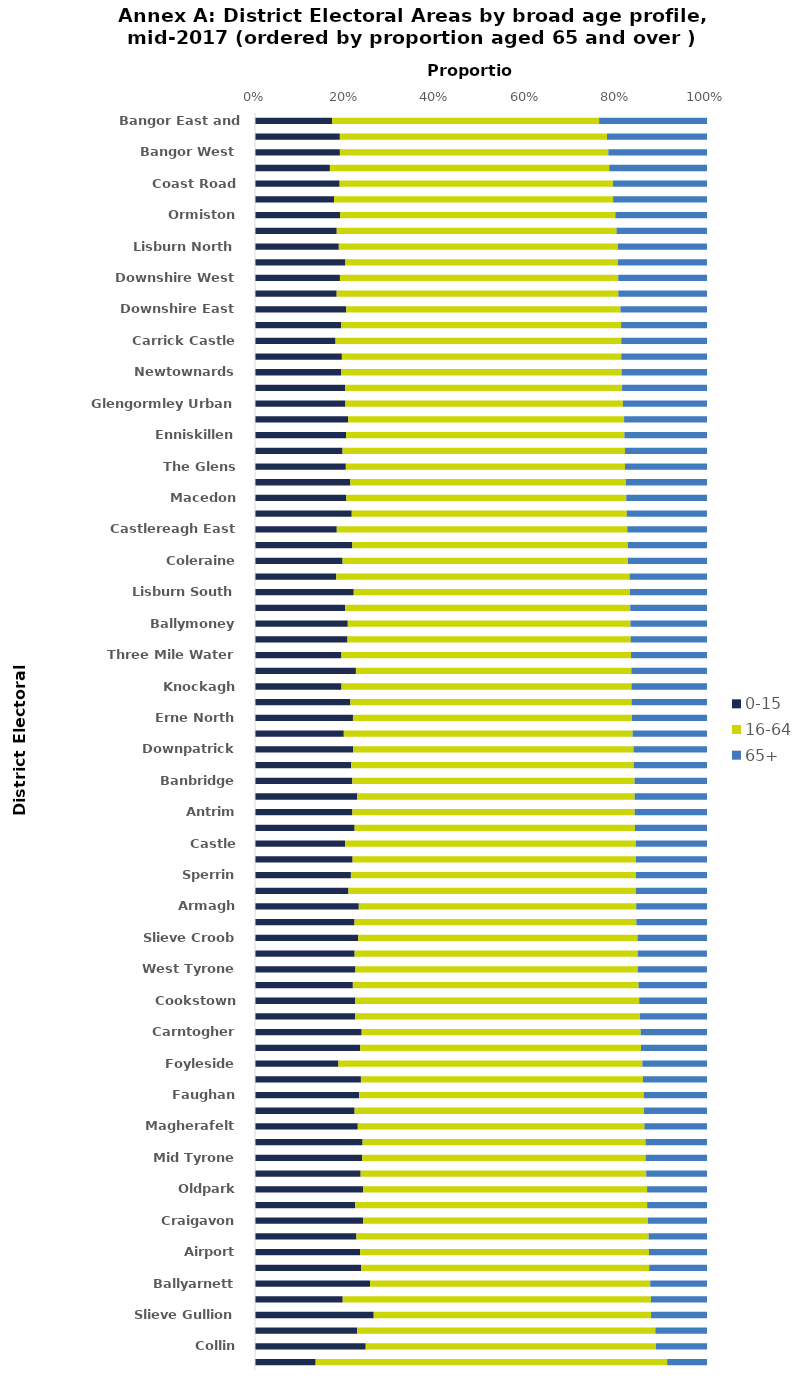
| Category | 0-15 | 16-64 | 65+ |
|---|---|---|---|
| Bangor East and Donaghadee | 17.049 | 59.087 | 23.868 |
| Holywood and Clandeboye | 18.776 | 59.106 | 22.123 |
| Bangor West | 18.782 | 59.399 | 21.819 |
| Causeway | 16.571 | 61.786 | 21.643 |
| Coast Road | 18.725 | 60.454 | 20.816 |
| Comber | 17.489 | 61.735 | 20.771 |
| Ormiston | 18.834 | 60.884 | 20.281 |
| Balmoral | 18.084 | 61.899 | 20.012 |
| Lisburn North | 18.546 | 61.737 | 19.721 |
| Ards Peninsula | 20.007 | 60.279 | 19.714 |
| Downshire West | 18.792 | 61.574 | 19.634 |
| Larne Lough | 18.074 | 62.307 | 19.619 |
| Downshire East | 20.196 | 60.678 | 19.127 |
| Ballymena | 19.088 | 61.908 | 19 |
| Carrick Castle | 17.822 | 63.209 | 18.969 |
| Rowallane | 19.219 | 61.817 | 18.964 |
| Newtownards | 19.067 | 62.041 | 18.891 |
| Bangor Central | 19.921 | 61.293 | 18.782 |
| Glengormley Urban | 20.008 | 61.383 | 18.609 |
| Braid | 20.59 | 61.074 | 18.337 |
| Enniskillen | 20.154 | 61.576 | 18.276 |
| Limavady | 19.372 | 62.468 | 18.159 |
| The Glens | 20.096 | 61.76 | 18.144 |
| Bann | 21.102 | 60.968 | 17.93 |
| Macedon | 20.208 | 61.938 | 17.859 |
| Erne West | 21.406 | 60.838 | 17.756 |
| Castlereagh East | 18.093 | 64.276 | 17.636 |
| The Mournes | 21.54 | 60.939 | 17.524 |
| Coleraine | 19.377 | 63.143 | 17.484 |
| Lisnasharragh | 17.991 | 64.911 | 17.102 |
| Lisburn South | 21.85 | 61.099 | 17.055 |
| Omagh | 19.93 | 63.082 | 16.988 |
| Ballymoney | 20.525 | 62.548 | 16.923 |
| Bannside | 20.468 | 62.65 | 16.882 |
| Three Mile Water | 19.127 | 64.068 | 16.805 |
| Erne East | 22.324 | 60.944 | 16.738 |
| Knockagh | 19.14 | 64.153 | 16.713 |
| Ballyclare | 21.109 | 62.201 | 16.69 |
| Erne North | 21.673 | 61.737 | 16.597 |
| Castlereagh South | 19.649 | 63.893 | 16.454 |
| Downpatrick | 21.749 | 61.996 | 16.255 |
| Derg | 21.272 | 62.508 | 16.221 |
| Banbridge | 21.543 | 62.429 | 16.028 |
| Cusher | 22.596 | 61.396 | 16.008 |
| Antrim | 21.545 | 62.457 | 15.998 |
| Court | 22.044 | 62.012 | 15.941 |
| Castle | 19.914 | 64.335 | 15.748 |
| Dunsilly | 21.588 | 62.675 | 15.737 |
| Sperrin | 21.221 | 63.046 | 15.733 |
| Waterside | 20.678 | 63.617 | 15.708 |
| Armagh | 22.964 | 61.374 | 15.662 |
| Portadown | 22.018 | 62.356 | 15.626 |
| Slieve Croob | 22.86 | 61.774 | 15.366 |
| Black Mountain | 22.042 | 62.615 | 15.343 |
| West Tyrone | 22.22 | 62.44 | 15.34 |
| Lurgan | 21.648 | 63.212 | 15.138 |
| Cookstown | 22.127 | 62.873 | 15 |
| Lagan River | 22.145 | 63.013 | 14.843 |
| Carntogher | 23.602 | 61.739 | 14.665 |
| Clogher Valley | 23.283 | 62.096 | 14.621 |
| Foyleside | 18.463 | 67.234 | 14.303 |
| Moyola | 23.434 | 62.394 | 14.172 |
| Faughan | 23.052 | 62.948 | 14 |
| Newry | 22.041 | 64.028 | 13.931 |
| Magherafelt | 22.742 | 63.417 | 13.846 |
| Torrent | 23.802 | 62.606 | 13.596 |
| Mid Tyrone | 23.721 | 62.7 | 13.579 |
| Crotlieve | 23.377 | 63.176 | 13.451 |
| Oldpark | 23.94 | 62.805 | 13.255 |
| The Moor | 22.174 | 64.598 | 13.234 |
| Craigavon | 23.902 | 63.025 | 13.07 |
| Benbradagh | 22.446 | 64.641 | 12.914 |
| Airport | 23.276 | 63.877 | 12.847 |
| Dungannon | 23.45 | 63.763 | 12.784 |
| Ballyarnett | 25.454 | 61.996 | 12.555 |
| Titanic | 19.405 | 68.192 | 12.403 |
| Slieve Gullion | 26.264 | 61.357 | 12.376 |
| Killultagh | 22.624 | 65.949 | 11.427 |
| Collin | 24.494 | 64.187 | 11.319 |
| Botanic | 13.418 | 77.769 | 8.813 |